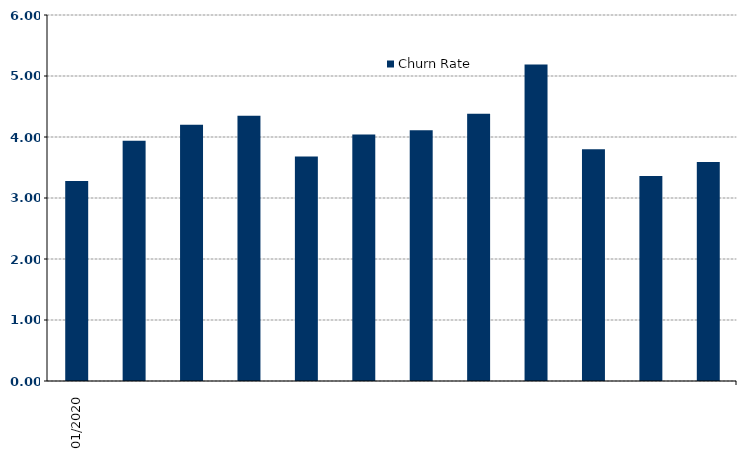
| Category | Churn Rate |
|---|---|
| 2020-01-01 | 3.28 |
| 2020-02-01 | 3.94 |
| 2020-03-01 | 4.2 |
| 2020-04-01 | 4.35 |
| 2020-05-01 | 3.68 |
| 2020-06-01 | 4.04 |
| 2020-07-01 | 4.11 |
| 2020-08-01 | 4.38 |
| 2020-09-01 | 5.19 |
| 2020-10-01 | 3.8 |
| 2020-11-01 | 3.36 |
| 2020-12-01 | 3.59 |